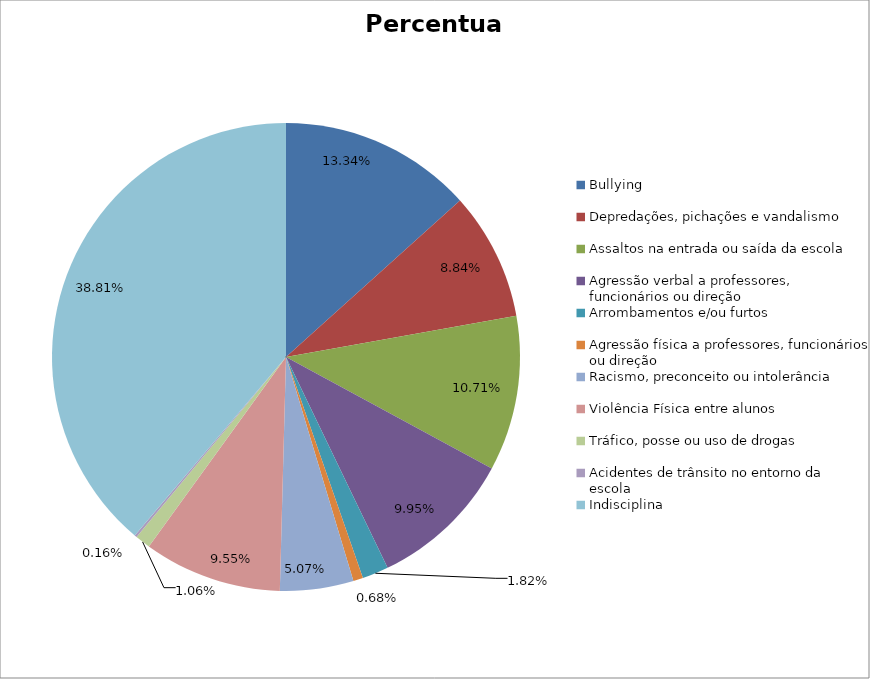
| Category | Percentual |
|---|---|
| Bullying | 0.133 |
| Depredações, pichações e vandalismo | 0.088 |
| Assaltos na entrada ou saída da escola | 0.107 |
| Agressão verbal a professores, funcionários ou direção | 0.1 |
| Arrombamentos e/ou furtos | 0.018 |
| Agressão física a professores, funcionários ou direção | 0.007 |
| Racismo, preconceito ou intolerância | 0.051 |
| Violência Física entre alunos | 0.095 |
| Tráfico, posse ou uso de drogas | 0.011 |
| Acidentes de trânsito no entorno da escola | 0.002 |
| Indisciplina | 0.388 |